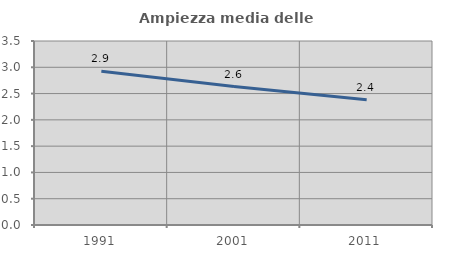
| Category | Ampiezza media delle famiglie |
|---|---|
| 1991.0 | 2.926 |
| 2001.0 | 2.634 |
| 2011.0 | 2.384 |